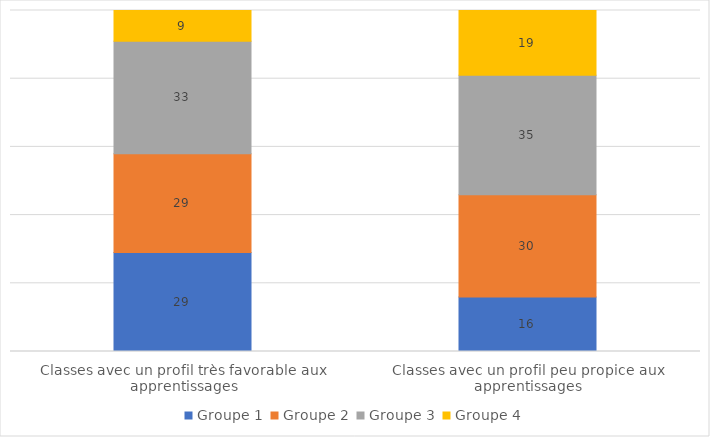
| Category | Groupe 1 | Groupe 2 | Groupe 3 | Groupe 4 |
|---|---|---|---|---|
| Classes avec un profil très favorable aux apprentissages | 29 | 29 | 33 | 9 |
| Classes avec un profil peu propice aux apprentissages | 16 | 30 | 35 | 19 |